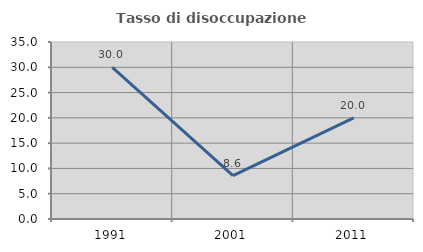
| Category | Tasso di disoccupazione giovanile  |
|---|---|
| 1991.0 | 30 |
| 2001.0 | 8.571 |
| 2011.0 | 20 |